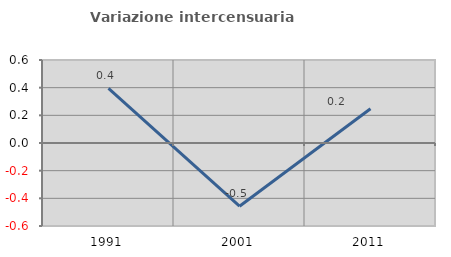
| Category | Variazione intercensuaria annua |
|---|---|
| 1991.0 | 0.396 |
| 2001.0 | -0.457 |
| 2011.0 | 0.247 |